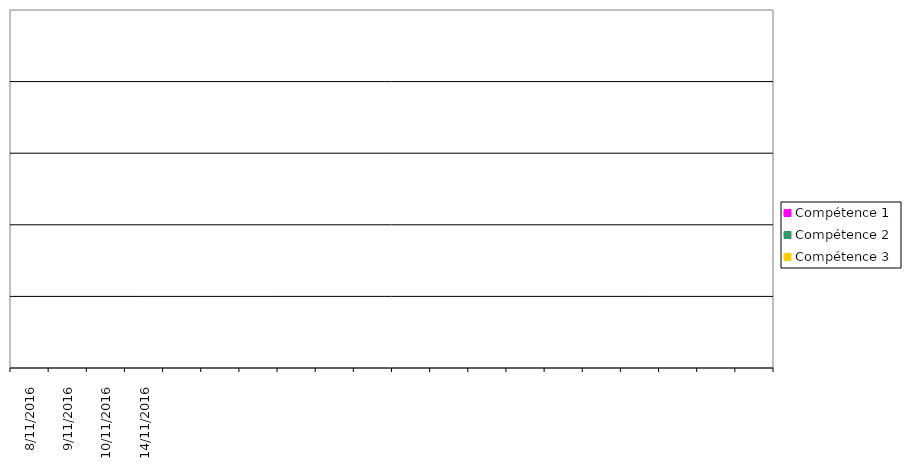
| Category | Compétence 1 | Compétence 2 | Compétence 3 |
|---|---|---|---|
| 8/11/2016 | 0 | 0 | 0 |
| 9/11/2016 | 0 | 0 | 0 |
| 10/11/2016 | 0 | 0 | 0 |
| 14/11/2016 | 0 | 0 | 0 |